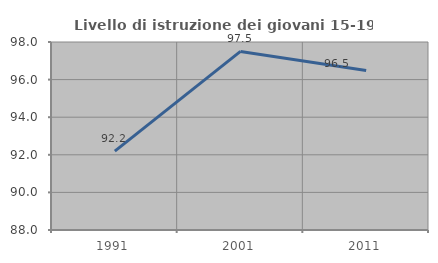
| Category | Livello di istruzione dei giovani 15-19 anni |
|---|---|
| 1991.0 | 92.192 |
| 2001.0 | 97.5 |
| 2011.0 | 96.482 |